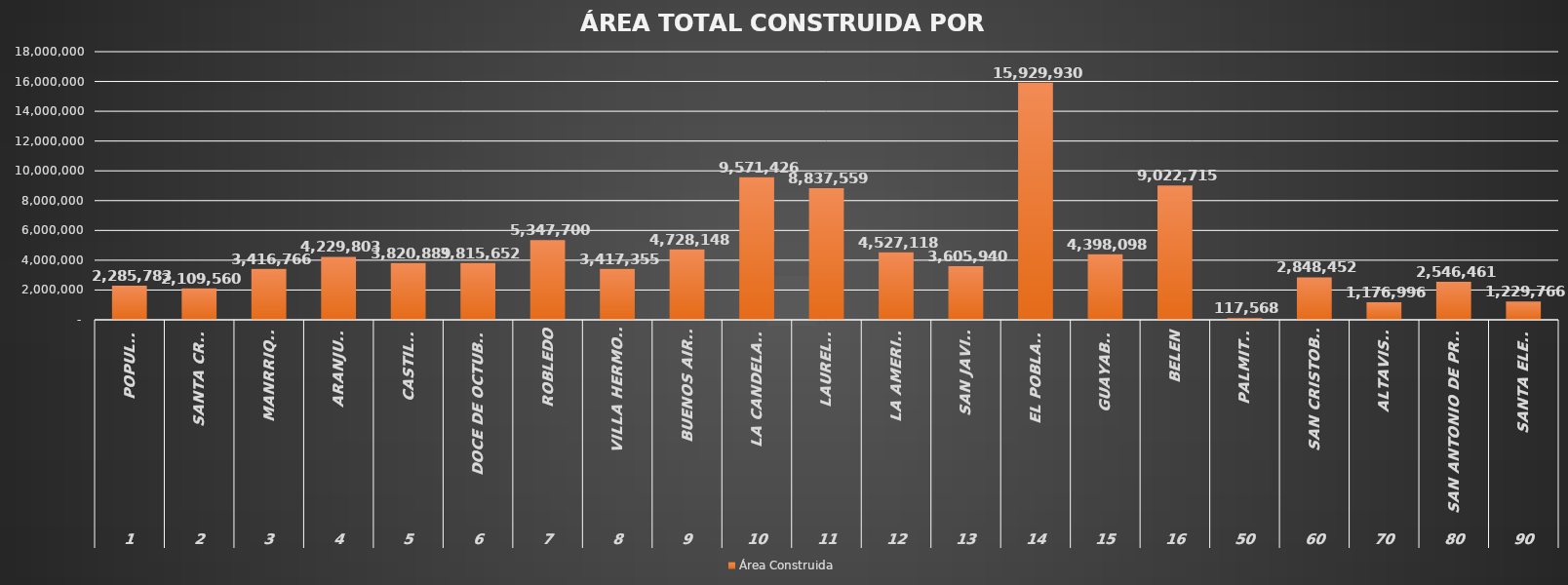
| Category | Área Construida |
|---|---|
| 0 | 2285783 |
| 1 | 2109560 |
| 2 | 3416766 |
| 3 | 4229803 |
| 4 | 3820889 |
| 5 | 3815652 |
| 6 | 5347700 |
| 7 | 3417355 |
| 8 | 4728148 |
| 9 | 9571426 |
| 10 | 8837559 |
| 11 | 4527118 |
| 12 | 3605940 |
| 13 | 15929930 |
| 14 | 4398098 |
| 15 | 9022715 |
| 16 | 117568 |
| 17 | 2848452 |
| 18 | 1176996 |
| 19 | 2546461 |
| 20 | 1229766 |